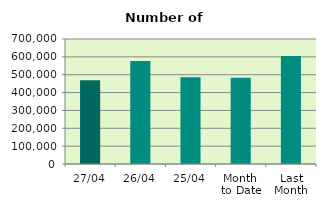
| Category | Series 0 |
|---|---|
| 27/04 | 469320 |
| 26/04 | 576440 |
| 25/04 | 485946 |
| Month 
to Date | 482323.882 |
| Last
Month | 605064 |